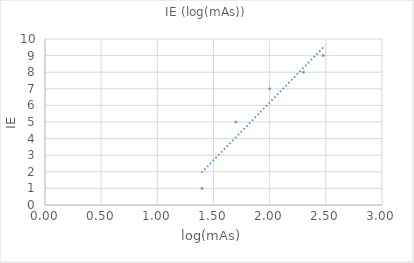
| Category | Series 0 |
|---|---|
| 1.3979400086720377 | 1 |
| 1.6989700043360187 | 5 |
| 2.0 | 7 |
| 2.3010299956639813 | 8 |
| 2.4771212547196626 | 9 |